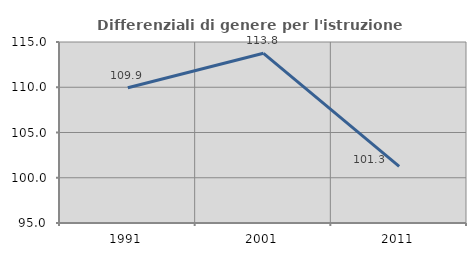
| Category | Differenziali di genere per l'istruzione superiore |
|---|---|
| 1991.0 | 109.943 |
| 2001.0 | 113.754 |
| 2011.0 | 101.252 |